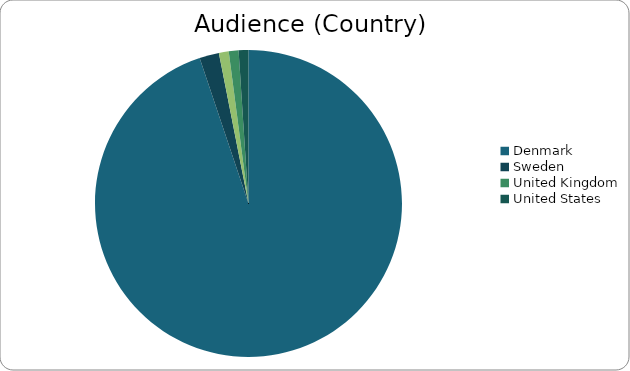
| Category | Series 0 |
|---|---|
| Denmark | 0.92 |
| Sweden | 0.02 |
| Germany | 0.01 |
| United Kingdom | 0.01 |
| United States | 0.01 |